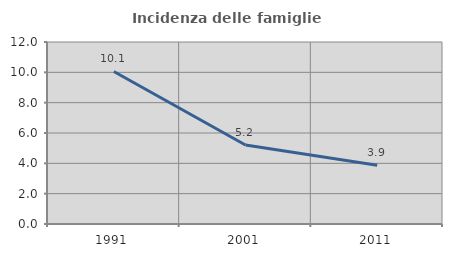
| Category | Incidenza delle famiglie numerose |
|---|---|
| 1991.0 | 10.056 |
| 2001.0 | 5.21 |
| 2011.0 | 3.876 |